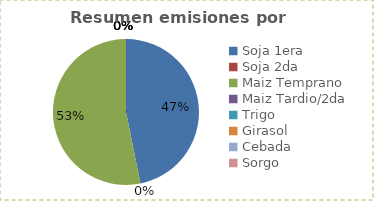
| Category | Series 0 |
|---|---|
| Soja 1era | 3227.09 |
| Soja 2da | 0 |
| Maiz Temprano | 3664.75 |
| Maiz Tardio/2da | 0 |
| Trigo | 0 |
| Girasol | 0 |
| Cebada | 0 |
| Sorgo | 0 |